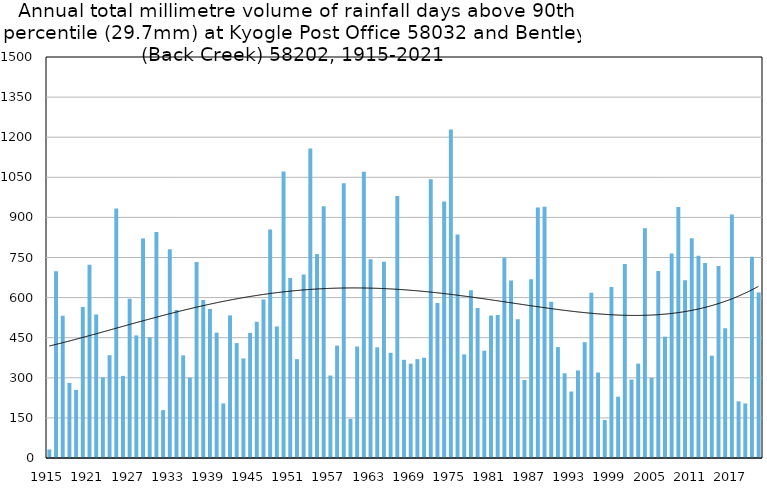
| Category | Annual total mm in days above 90th percentile |
|---|---|
| 1915 | 31.8 |
| 1916 | 698.8 |
| 1917 | 531.7 |
| 1918 | 280.9 |
| 1919 | 254.6 |
| 1920 | 564.8 |
| 1921 | 723.2 |
| 1922 | 537.2 |
| 1923 | 301.8 |
| 1924 | 384.5 |
| 1925 | 933.4 |
| 1926 | 307.2 |
| 1927 | 595.9 |
| 1928 | 458.6 |
| 1929 | 821.4 |
| 1930 | 451.4 |
| 1931 | 845.7 |
| 1932 | 179.1 |
| 1933 | 780.8 |
| 1934 | 553.4 |
| 1935 | 383.9 |
| 1936 | 300.7 |
| 1937 | 732.7 |
| 1938 | 591.4 |
| 1939 | 557.7 |
| 1940 | 468.9 |
| 1941 | 204.1 |
| 1942 | 533.3 |
| 1943 | 429.9 |
| 1944 | 372.5 |
| 1945 | 468 |
| 1946 | 509.7 |
| 1947 | 593.3 |
| 1948 | 854.4 |
| 1949 | 491.9 |
| 1950 | 1071.6 |
| 1951 | 673.6 |
| 1952 | 369.7 |
| 1953 | 686.2 |
| 1954 | 1157.4 |
| 1955 | 762.8 |
| 1956 | 941.6 |
| 1957 | 308.5 |
| 1958 | 420.5 |
| 1959 | 1028 |
| 1960 | 146.6 |
| 1961 | 417.1 |
| 1962 | 1071.2 |
| 1963 | 743.7 |
| 1964 | 413.9 |
| 1965 | 734.3 |
| 1966 | 393.5 |
| 1967 | 980.3 |
| 1968 | 367.2 |
| 1969 | 352.8 |
| 1970 | 369.9 |
| 1971 | 374.9 |
| 1972 | 1042.7 |
| 1973 | 580.1 |
| 1974 | 959.8 |
| 1975 | 1229.1 |
| 1976 | 835.8 |
| 1977 | 387.6 |
| 1978 | 627.2 |
| 1979 | 561 |
| 1980 | 401.4 |
| 1981 | 532.8 |
| 1982 | 535.2 |
| 1983 | 748.6 |
| 1984 | 664 |
| 1985 | 519.4 |
| 1986 | 292 |
| 1987 | 668.4 |
| 1988 | 937 |
| 1989 | 940 |
| 1990 | 584.6 |
| 1991 | 414.8 |
| 1992 | 317 |
| 1993 | 248.6 |
| 1994 | 327.6 |
| 1995 | 433.2 |
| 1996 | 618 |
| 1997 | 319.6 |
| 1998 | 142 |
| 1999 | 639.4 |
| 2000 | 229.4 |
| 2001 | 725.9 |
| 2002 | 293.4 |
| 2003 | 353 |
| 2004 | 859.4 |
| 2005 | 299.6 |
| 2006 | 699.4 |
| 2007 | 453.8 |
| 2008 | 765.2 |
| 2009 | 938.6 |
| 2010 | 664.6 |
| 2011 | 821.6 |
| 2012 | 756.4 |
| 2013 | 729.6 |
| 2014 | 382.8 |
| 2015 | 717.8 |
| 2016 | 485.1 |
| 2017 | 911 |
| 2018 | 212 |
| 2019 | 204 |
| 2020 | 753 |
| 2021 | 619 |